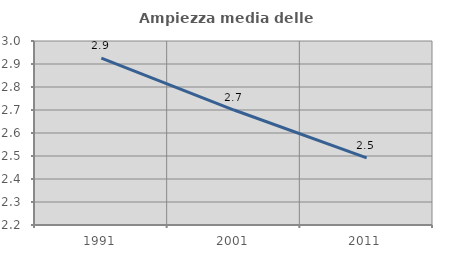
| Category | Ampiezza media delle famiglie |
|---|---|
| 1991.0 | 2.925 |
| 2001.0 | 2.7 |
| 2011.0 | 2.492 |